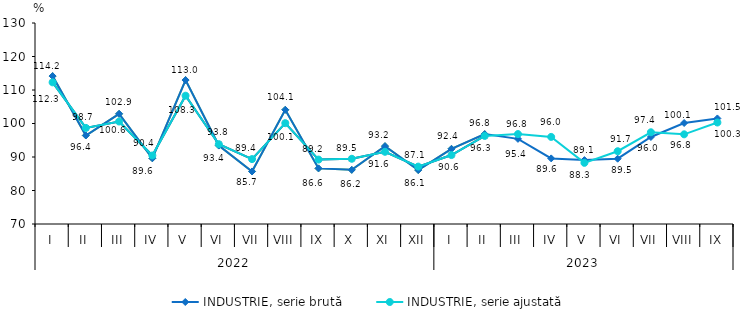
| Category | INDUSTRIE, serie brută | INDUSTRIE, serie ajustată |
|---|---|---|
| 0 | 114.151 | 112.283 |
| 1 | 96.419 | 98.68 |
| 2 | 102.886 | 100.594 |
| 3 | 89.614 | 90.447 |
| 4 | 112.973 | 108.294 |
| 5 | 93.417 | 93.82 |
| 6 | 85.678 | 89.372 |
| 7 | 104.099 | 100.102 |
| 8 | 86.603 | 89.228 |
| 9 | 86.164 | 89.466 |
| 10 | 93.241 | 91.558 |
| 11 | 86.103 | 87.134 |
| 12 | 92.442 | 90.58 |
| 13 | 96.83 | 96.297 |
| 14 | 95.412 | 96.841 |
| 15 | 89.583 | 95.998 |
| 16 | 89.076 | 88.254 |
| 17 | 89.492 | 91.722 |
| 18 | 95.973 | 97.381 |
| 19 | 100.143 | 96.768 |
| 20 | 101.508 | 100.297 |